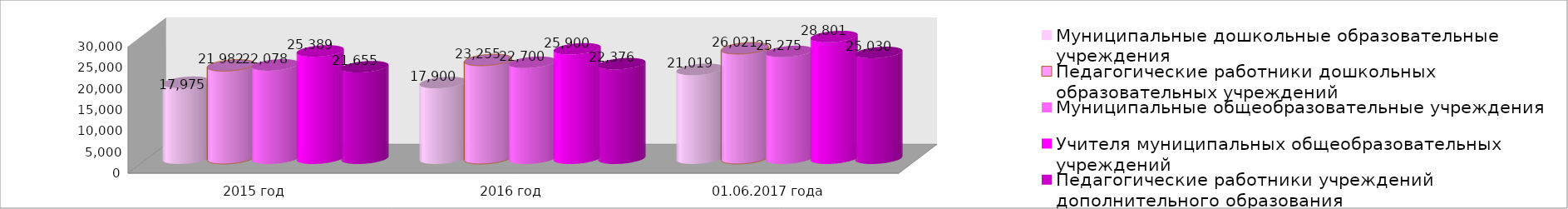
| Category | Муниципальные дошкольные образовательные учреждения | Педагогические работники дошкольных образовательных учреждений | Муниципальные общеобразовательные учреждения | Учителя муниципальных общеобразовательных учреждений | Педагогические работники учреждений дополнительного образования |
|---|---|---|---|---|---|
| 2015 год | 17975 | 21982 | 22078 | 25389 | 21655 |
| 2016 год | 17900 | 23255 | 22700 | 25900 | 22376 |
| 01.06.2017 года | 21019 | 26021 | 25275 | 28801 | 25030 |